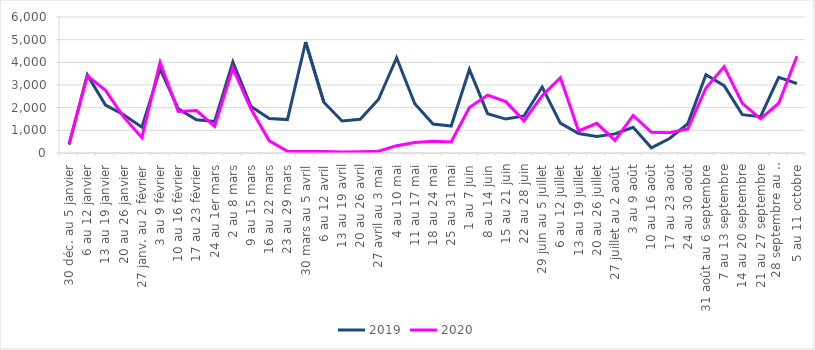
| Category | 2019 | 2020 |
|---|---|---|
| 30 déc. au 5 janvier | 369 | 411 |
| 6 au 12 janvier | 3446 | 3400 |
| 13 au 19 janvier | 2117 | 2765 |
| 20 au 26 janvier | 1689 | 1587 |
| 27 janv. au 2 février | 1140 | 678 |
| 3 au 9 février | 3711 | 4002 |
| 10 au 16 février | 1947 | 1834 |
| 17 au 23 février | 1464 | 1874 |
| 24 au 1er mars | 1389 | 1178 |
| 2 au 8 mars | 4019 | 3741 |
| 9 au 15 mars | 2049 | 1927 |
| 16 au 22 mars | 1525 | 536 |
| 23 au 29 mars | 1473 | 74 |
| 30 mars au 5 avril | 4896 | 61 |
| 6 au 12 avril | 2237 | 69 |
| 13 au 19 avril | 1410 | 40 |
| 20 au 26 avril | 1489 | 59 |
| 27 avril au 3 mai | 2361 | 79 |
| 4 au 10 mai | 4200 | 324 |
| 11 au 17 mai | 2172 | 463 |
| 18 au 24 mai | 1275 | 517 |
| 25 au 31 mai | 1190 | 488 |
| 1 au 7 juin | 3685 | 2004 |
| 8 au 14 juin | 1736 | 2554 |
| 15 au 21 juin | 1497 | 2267 |
| 22 au 28 juin | 1634 | 1420 |
| 29 juin au 5 juillet | 2913 | 2532 |
| 6 au 12 juillet | 1321 | 3323 |
| 13 au 19 juillet | 858 | 974 |
| 20 au 26 juillet | 730 | 1307 |
| 27 juillet au 2 août | 843 | 557 |
| 3 au 9 août | 1137 | 1657 |
| 10 au 16 août | 229 | 911 |
| 17 au 23 août | 641 | 890 |
| 24 au 30 août | 1291 | 1058 |
| 31 août au 6 septembre | 3457 | 2862 |
| 7 au 13 septembre | 2973 | 3810 |
| 14 au 20 septembre | 1692 | 2193 |
| 21 au 27 septembre | 1603 | 1510 |
|  28 septembre au 4 octobre | 3335 | 2195 |
| 5 au 11 octobre | 3066 | 4268 |